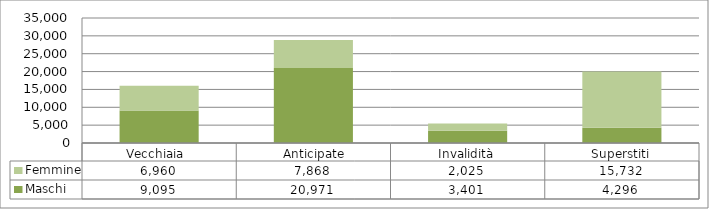
| Category | Maschi | Femmine |
|---|---|---|
| Vecchiaia  | 9095 | 6960 |
|  Anticipate | 20971 | 7868 |
| Invalidità | 3401 | 2025 |
| Superstiti | 4296 | 15732 |